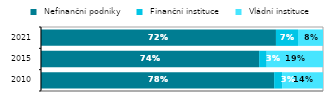
| Category |  Nefinanční podniky  |  Finanční instituce  |  Vládní instituce  |
|---|---|---|---|
| 2010.0 | 0.779 | 0.027 | 0.137 |
| 2015.0 | 0.736 | 0.026 | 0.19 |
| 2021.0 | 0.718 | 0.067 | 0.076 |